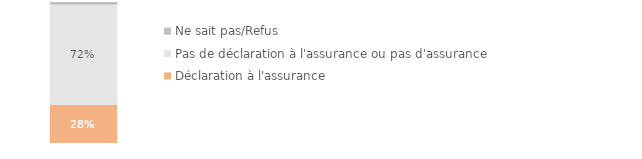
| Category | Déclaration à l'assurance | Pas de déclaration à l'assurance ou pas d'assurance | Ne sait pas/Refus |
|---|---|---|---|
| Ensemble des ménages victimes | 0.278 | 0.718 | 0.01 |